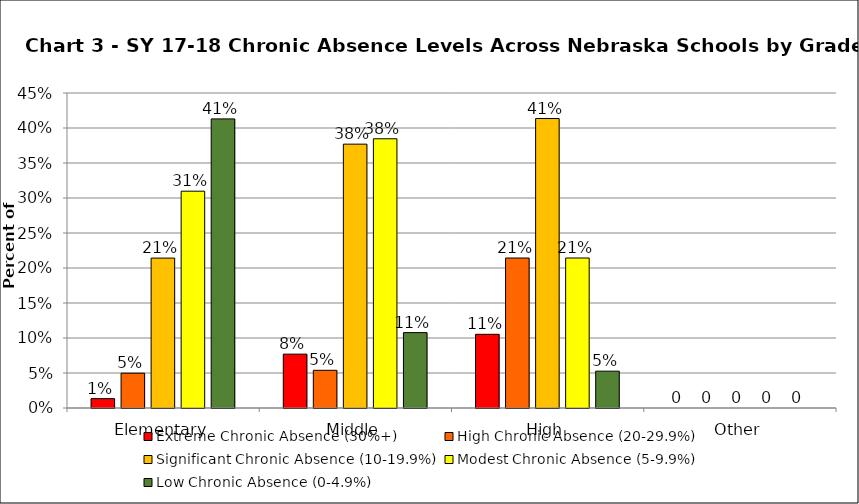
| Category | Extreme Chronic Absence (30%+) | High Chronic Absence (20-29.9%) | Significant Chronic Absence (10-19.9%) | Modest Chronic Absence (5-9.9%) | Low Chronic Absence (0-4.9%) |
|---|---|---|---|---|---|
| 0 | 0.013 | 0.05 | 0.214 | 0.31 | 0.413 |
| 1 | 0.077 | 0.054 | 0.377 | 0.385 | 0.108 |
| 2 | 0.105 | 0.214 | 0.414 | 0.214 | 0.053 |
| 3 | 0 | 0 | 0 | 0 | 0 |